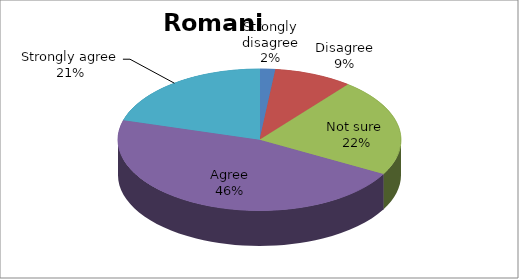
| Category | Series 0 |
|---|---|
| Strongly disagree | 2 |
| Disagree | 10 |
| Not sure  | 25 |
| Agree | 52 |
| Strongly agree | 23 |